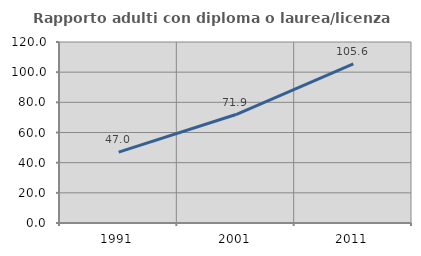
| Category | Rapporto adulti con diploma o laurea/licenza media  |
|---|---|
| 1991.0 | 47.018 |
| 2001.0 | 71.913 |
| 2011.0 | 105.556 |